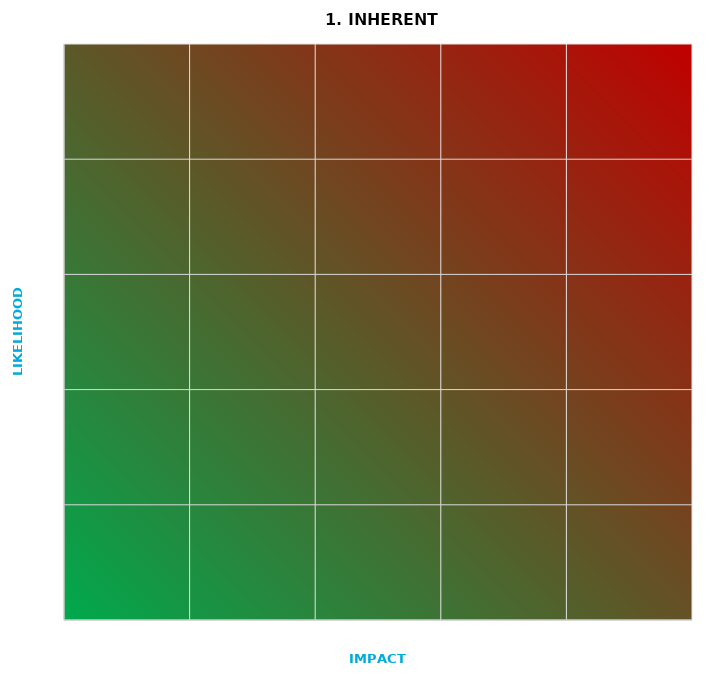
| Category | Inherent risk |
|---|---|
| 0.0 | 0 |
| 0.0 | 0 |
| 0.0 | 0 |
| 0.0 | 0 |
| 0.0 | 0 |
| 0.0 | 0 |
| 0.0 | 0 |
| 0.0 | 0 |
| 0.0 | 0 |
| 0.0 | 0 |
| 0.0 | 0 |
| 0.0 | 0 |
| 0.0 | 0 |
| 0.0 | 0 |
| 0.0 | 0 |
| 0.0 | 0 |
| 0.0 | 0 |
| 0.0 | 0 |
| 0.0 | 0 |
| 0.0 | 0 |
| 0.0 | 0 |
| 0.0 | 0 |
| 0.0 | 0 |
| 0.0 | 0 |
| 0.0 | 0 |
| 0.0 | 0 |
| 0.0 | 0 |
| 0.0 | 0 |
| 0.0 | 0 |
| 0.0 | 0 |
| 0.0 | 0 |
| 0.0 | 0 |
| 0.0 | 0 |
| 0.0 | 0 |
| 0.0 | 0 |
| 0.0 | 0 |
| 0.0 | 0 |
| 0.0 | 0 |
| 0.0 | 0 |
| 0.0 | 0 |
| 0.0 | 0 |
| 0.0 | 0 |
| 0.0 | 0 |
| 0.0 | 0 |
| 0.0 | 0 |
| 0.0 | 0 |
| 0.0 | 0 |
| 0.0 | 0 |
| 0.0 | 0 |
| 0.0 | 0 |